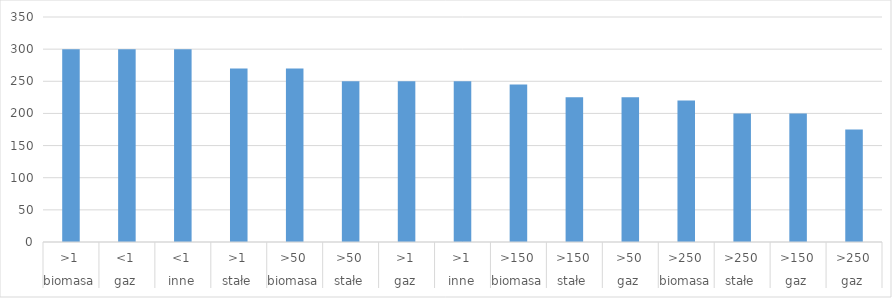
| Category | koszty operacyjne |
|---|---|
| 0 | 300 |
| 1 | 300 |
| 2 | 300 |
| 3 | 270 |
| 4 | 270 |
| 5 | 250 |
| 6 | 250 |
| 7 | 250 |
| 8 | 245 |
| 9 | 225 |
| 10 | 225 |
| 11 | 220 |
| 12 | 200 |
| 13 | 200 |
| 14 | 175 |